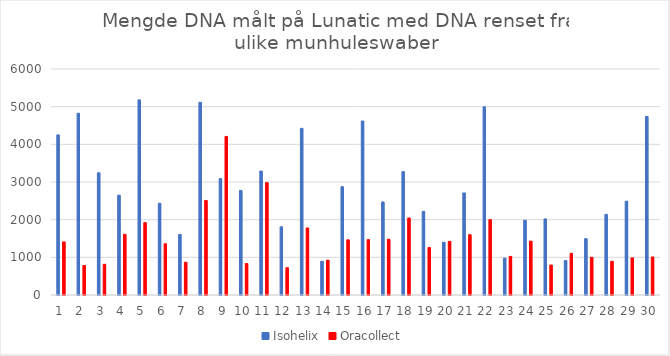
| Category | Isohelix | Oracollect |
|---|---|---|
| 1.0 | 4250 | 1410 |
| 2.0 | 4825 | 785 |
| 3.0 | 3245 | 815 |
| 4.0 | 2650 | 1610 |
| 5.0 | 5180 | 1920 |
| 6.0 | 2435 | 1360 |
| 7.0 | 1610 | 870 |
| 8.0 | 5115 | 2510 |
| 9.0 | 3090 | 4210 |
| 10.0 | 2775 | 835 |
| 11.0 | 3290 | 2985 |
| 12.0 | 1810 | 725 |
| 13.0 | 4425 | 1780 |
| 14.0 | 895 | 925 |
| 15.0 | 2875 | 1465 |
| 16.0 | 4620 | 1470 |
| 17.0 | 2470 | 1480 |
| 18.0 | 3275 | 2045 |
| 19.0 | 2220 | 1260 |
| 20.0 | 1400 | 1425 |
| 21.0 | 2710 | 1600 |
| 22.0 | 4995 | 2000 |
| 23.0 | 980 | 1025 |
| 24.0 | 1985 | 1430 |
| 25.0 | 2020 | 795 |
| 26.0 | 915 | 1105 |
| 27.0 | 1495 | 1000 |
| 28.0 | 2140 | 895 |
| 29.0 | 2490 | 985 |
| 30.0 | 4740 | 1010 |